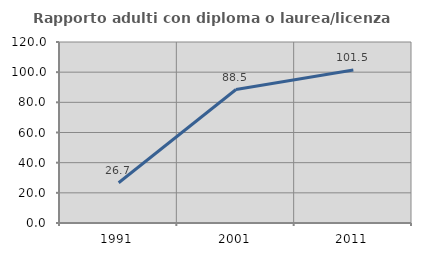
| Category | Rapporto adulti con diploma o laurea/licenza media  |
|---|---|
| 1991.0 | 26.684 |
| 2001.0 | 88.504 |
| 2011.0 | 101.484 |